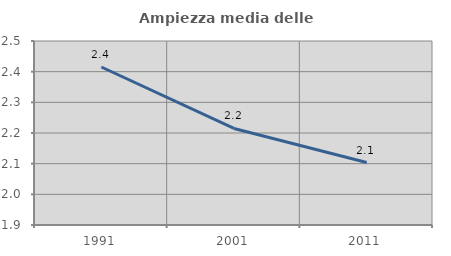
| Category | Ampiezza media delle famiglie |
|---|---|
| 1991.0 | 2.415 |
| 2001.0 | 2.215 |
| 2011.0 | 2.104 |